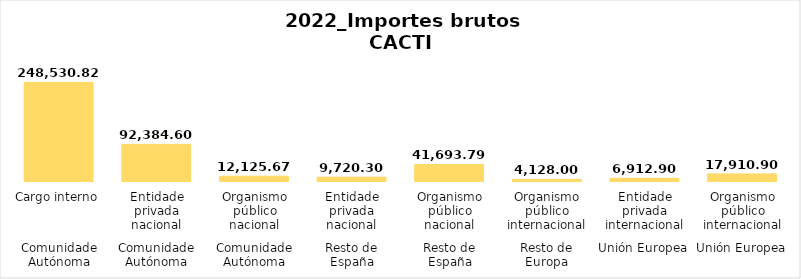
| Category | Series 0 |
|---|---|
| 0 | 248530.815 |
| 1 | 92384.595 |
| 2 | 12125.669 |
| 3 | 9720.298 |
| 4 | 41693.793 |
| 5 | 4128 |
| 6 | 6912.9 |
| 7 | 17910.9 |